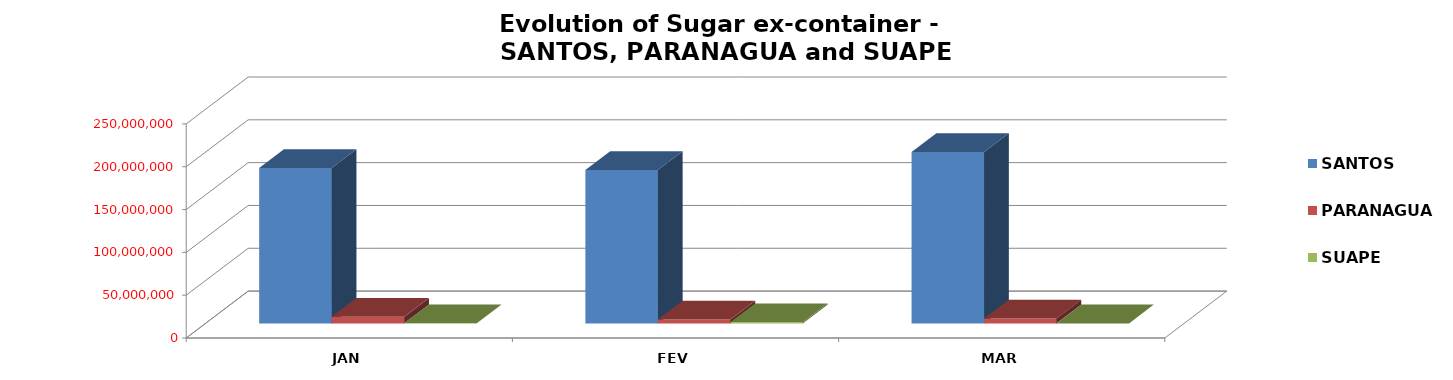
| Category | SANTOS | PARANAGUA | SUAPE |
|---|---|---|---|
| JAN | 181496881 | 7631264 | 200400 |
| FEV | 179083605 | 4474006 | 1183920 |
| MAR | 200056852 | 5823258 | 0 |